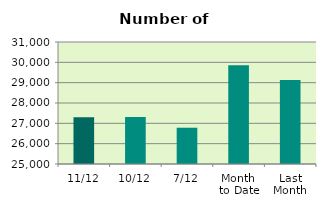
| Category | Series 0 |
|---|---|
| 11/12 | 27304 |
| 10/12 | 27308 |
| 7/12 | 26784 |
| Month 
to Date | 29861.429 |
| Last
Month | 29125.182 |